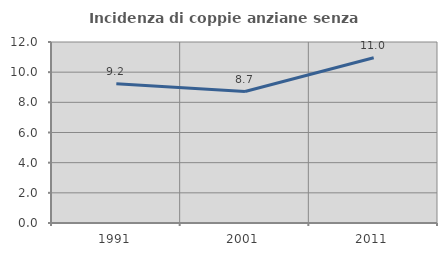
| Category | Incidenza di coppie anziane senza figli  |
|---|---|
| 1991.0 | 9.239 |
| 2001.0 | 8.715 |
| 2011.0 | 10.952 |